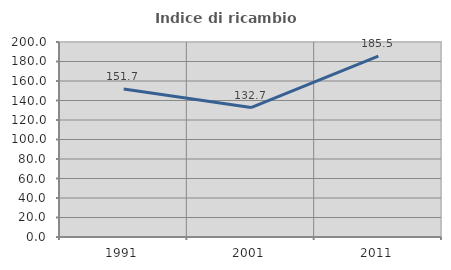
| Category | Indice di ricambio occupazionale  |
|---|---|
| 1991.0 | 151.685 |
| 2001.0 | 132.716 |
| 2011.0 | 185.484 |